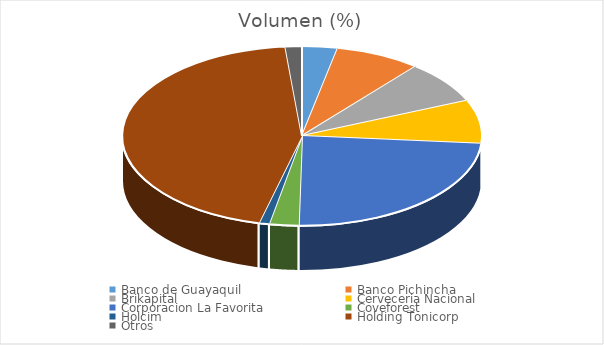
| Category | Volumen |
|---|---|
| Banco de Guayaquil | 21671.5 |
| Banco Pichincha | 52072 |
| Brikapital | 52000 |
| Cerveceria Nacional | 52910 |
| Corporacion La Favorita | 161859.92 |
| Coveforest | 17960.8 |
| Holcim | 6200 |
| Holding Tonicorp | 302400 |
| Otros | 10029 |